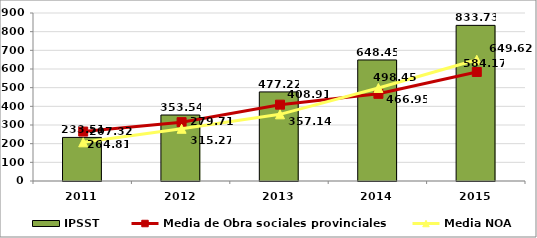
| Category | IPSST |
|---|---|
| 2011.0 | 233.51 |
| 2012.0 | 353.54 |
| 2013.0 | 477.22 |
| 2014.0 | 648.45 |
| 2015.0 | 833.73 |